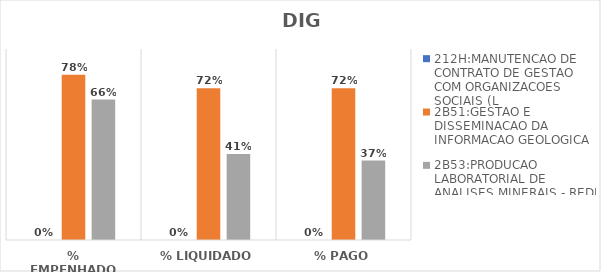
| Category | 212H:MANUTENCAO DE CONTRATO DE GESTAO COM ORGANIZACOES SOCIAIS (L | 2B51:GESTAO E DISSEMINACAO DA INFORMACAO GEOLOGICA | 2B53:PRODUCAO LABORATORIAL DE ANALISES MINERAIS - REDE LAMIN |
|---|---|---|---|
| % EMPENHADO | 0 | 0.779 | 0.662 |
| % LIQUIDADO | 0 | 0.715 | 0.405 |
| % PAGO | 0 | 0.715 | 0.374 |